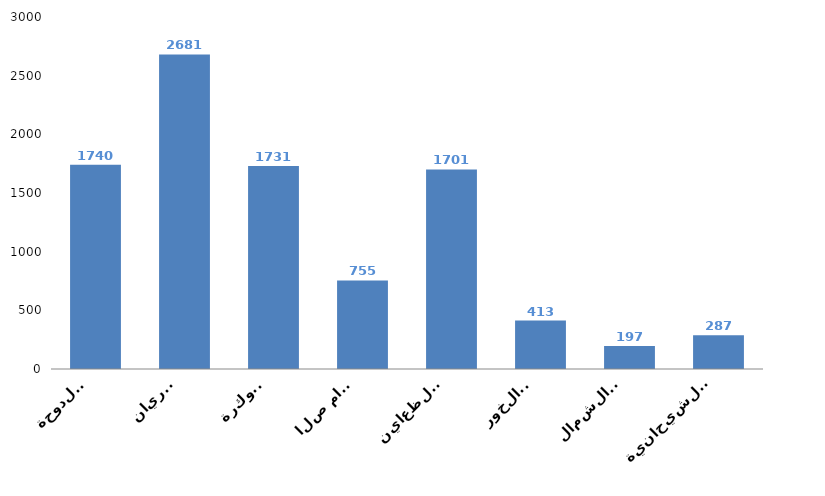
| Category | Series 0 |
|---|---|
| الدوحة
Doha | 1740 |
| الريان
Rayyan | 2681 |
| الوكرة
Wakrah | 1731 |
| ام صلال
Umm Slal | 755 |
| الظعاين
Al-Daayen | 1701 |
| الخور
Al-Khor | 413 |
| الشمال
Al-Shamal | 197 |
| الشيحانية
Al-Shahhaniya | 287 |